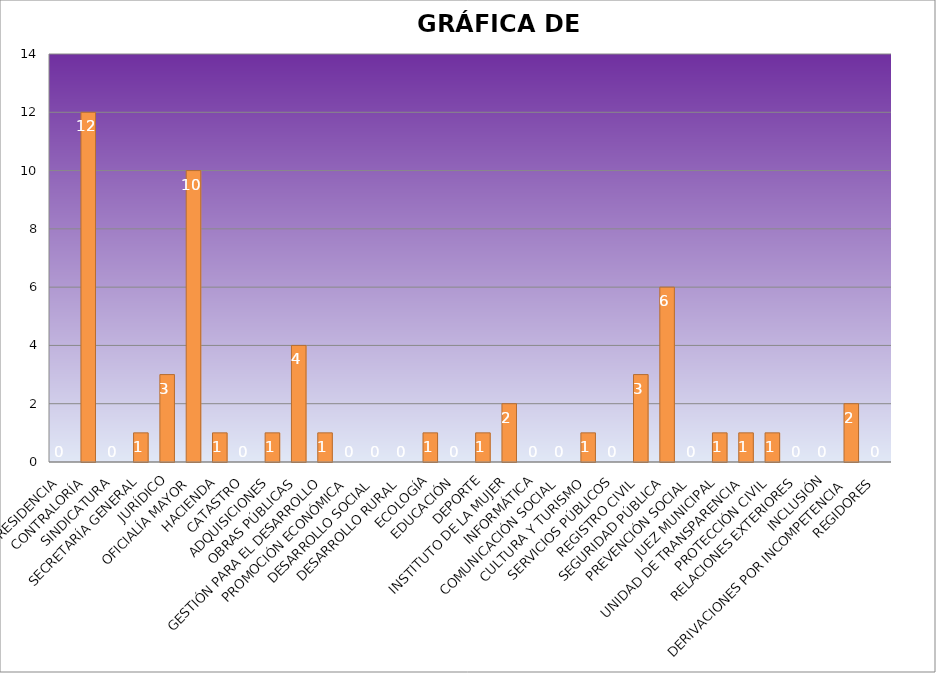
| Category | Series 0 |
|---|---|
| PRESIDENCIA | 0 |
| CONTRALORÍA | 12 |
| SINDICATURA | 0 |
| SECRETARÍA GENERAL | 1 |
| JURÍDICO | 3 |
| OFICIALÍA MAYOR | 10 |
| HACIENDA | 1 |
| CATASTRO | 0 |
| ADQUISICIONES | 1 |
| OBRAS PÚBLICAS | 4 |
| GESTIÓN PARA EL DESARROLLO | 1 |
| PROMOCIÓN ECONÓMICA | 0 |
| DESARROLLO SOCIAL | 0 |
| DESARROLLO RURAL | 0 |
| ECOLOGÍA | 1 |
| EDUCACIÓN | 0 |
| DEPORTE | 1 |
| INSTITUTO DE LA MUJER | 2 |
| INFORMÁTICA | 0 |
| COMUNICACIÓN SOCIAL | 0 |
| CULTURA Y TURISMO | 1 |
| SERVICIOS PÚBLICOS | 0 |
| REGISTRO CIVIL | 3 |
| SEGURIDAD PÚBLICA | 6 |
| PREVENCIÓN SOCIAL | 0 |
| JUEZ MUNICIPAL | 1 |
| UNIDAD DE TRANSPARENCIA | 1 |
| PROTECCIÓN CIVIL | 1 |
| RELACIONES EXTERIORES | 0 |
| INCLUSIÓN | 0 |
| DERIVACIONES POR INCOMPETENCIA | 2 |
| REGIDORES | 0 |